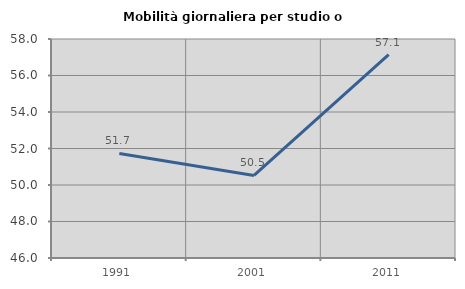
| Category | Mobilità giornaliera per studio o lavoro |
|---|---|
| 1991.0 | 51.73 |
| 2001.0 | 50.521 |
| 2011.0 | 57.143 |